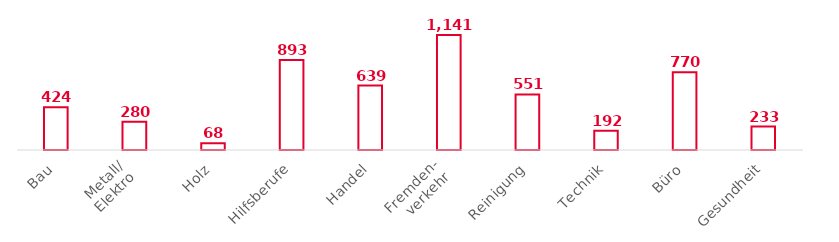
| Category | Series 0 |
|---|---|
| Bau | 424 |
| Metall/
Elektro | 280 |
| Holz | 68 |
| Hilfsberufe | 893 |
| Handel | 639 |
| Fremden-
verkehr | 1141 |
| Reinigung | 551 |
| Technik | 192 |
| Büro | 770 |
| Gesundheit | 233 |